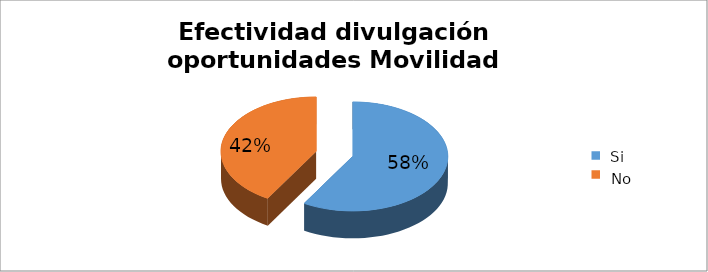
| Category | Series 0 |
|---|---|
| 0 | 0.585 |
| 1 | 0.415 |